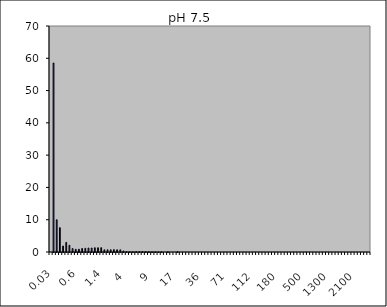
| Category | AH pH 7,5 1Nb |
|---|---|
| 0.03 | 0 |
| 0.04 | 58.547 |
| 0.07 | 9.993 |
| 0.1 | 7.539 |
| 0.2 | 1.846 |
| 0.3 | 2.985 |
| 0.4 | 2.088 |
| 0.5 | 1.068 |
| 0.6 | 0.844 |
| 0.7 | 0.861 |
| 0.8 | 1.085 |
| 0.9 | 1.153 |
| 1.0 | 1.232 |
| 1.1 | 1.235 |
| 1.2 | 1.318 |
| 1.3 | 1.32 |
| 1.4 | 1.344 |
| 1.6 | 0.678 |
| 1.8 | 0.692 |
| 2.0 | 0.687 |
| 2.2 | 0.728 |
| 2.4 | 0.694 |
| 2.6 | 0.679 |
| 3.0 | 0.316 |
| 4.0 | 0.094 |
| 5.0 | 0.081 |
| 6.0 | 0.066 |
| 6.5 | 0.113 |
| 7.0 | 0.122 |
| 7.5 | 0.131 |
| 8.0 | 0.094 |
| 8.5 | 0.1 |
| 9.0 | 0.053 |
| 10.0 | 0.057 |
| 11.0 | 0.032 |
| 12.0 | 0.035 |
| 13.0 | 0 |
| 14.0 | 0.041 |
| 15.0 | 0 |
| 16.0 | 0 |
| 17.0 | 0.05 |
| 18.0 | 0 |
| 19.0 | 0 |
| 20.0 | 0 |
| 22.0 | 0 |
| 25.0 | 0 |
| 28.0 | 0 |
| 32.0 | 0 |
| 36.0 | 0 |
| 38.0 | 0 |
| 40.0 | 0 |
| 45.0 | 0 |
| 50.0 | 0 |
| 53.0 | 0 |
| 56.0 | 0 |
| 63.0 | 0 |
| 71.0 | 0 |
| 75.0 | 0 |
| 80.0 | 0 |
| 85.0 | 0 |
| 90.0 | 0 |
| 95.0 | 0 |
| 100.0 | 0 |
| 106.0 | 0 |
| 112.0 | 0 |
| 125.0 | 0 |
| 130.0 | 0 |
| 140.0 | 0 |
| 145.0 | 0 |
| 150.0 | 0 |
| 160.0 | 0 |
| 170.0 | 0 |
| 180.0 | 0 |
| 190.0 | 0 |
| 200.0 | 0 |
| 212.0 | 0 |
| 242.0 | 0 |
| 250.0 | 0 |
| 300.0 | 0 |
| 400.0 | 0 |
| 500.0 | 0 |
| 600.0 | 0 |
| 700.0 | 0 |
| 800.0 | 0 |
| 900.0 | 0 |
| 1000.0 | 0 |
| 1100.0 | 0 |
| 1200.0 | 0 |
| 1300.0 | 0 |
| 1400.0 | 0 |
| 1500.0 | 0 |
| 1600.0 | 0 |
| 1700.0 | 0 |
| 1800.0 | 0 |
| 1900.0 | 0 |
| 2000.0 | 0 |
| 2100.0 | 0 |
| 2200.0 | 0 |
| 2300.0 | 0 |
| 2400.0 | 0 |
| 2500.0 | 0 |